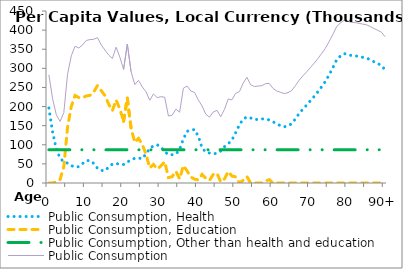
| Category | Public Consumption, Health | Public Consumption, Education | Public Consumption, Other than health and education | Public Consumption |
|---|---|---|---|---|
| 0 | 196111.92 | 0 | 86906.527 | 283018.44 |
|  | 133436.5 | 0 | 86906.527 | 220343.03 |
| 2 | 88632.806 | 2749.898 | 86906.527 | 178289.23 |
| 3 | 64920.223 | 9234.237 | 86906.527 | 161060.99 |
| 4 | 55181.159 | 42082.676 | 86906.527 | 184170.36 |
| 5 | 52090.713 | 145579.95 | 86906.527 | 284577.19 |
| 6 | 45502.735 | 200275.88 | 86906.527 | 332685.14 |
| 7 | 41794.125 | 229000.18 | 86906.527 | 357700.83 |
| 8 | 42657.942 | 223714.41 | 86906.527 | 353278.88 |
| 9 | 50692.114 | 223401.37 | 86906.527 | 361000.01 |
| 10 | 58287.313 | 227707.2 | 86906.527 | 372901.04 |
| 11 | 59000.461 | 229280.22 | 86906.527 | 375187.21 |
| 12 | 51262.619 | 237731.64 | 86906.527 | 375900.78 |
| 13 | 38568.938 | 254785.27 | 86906.527 | 380260.73 |
| 14 | 32911.893 | 241824.55 | 86906.527 | 361642.97 |
| 15 | 32064.109 | 228889.46 | 86906.527 | 347860.09 |
| 16 | 41484.848 | 206529.03 | 86906.527 | 334920.41 |
| 17 | 49717.776 | 189167.73 | 86906.527 | 325792.03 |
| 18 | 51174.337 | 217219.57 | 86906.527 | 355300.43 |
| 19 | 48600.894 | 193762.46 | 86906.527 | 329269.88 |
| 20 | 48534.251 | 161704.42 | 86906.527 | 297145.19 |
| 21 | 54552.955 | 222156.35 | 86906.527 | 363615.83 |
| 22 | 60771.749 | 143551.48 | 86906.527 | 291229.75 |
| 23 | 64640.351 | 106068.21 | 86906.527 | 257615.09 |
| 24 | 65148.004 | 116537.11 | 86906.527 | 268591.64 |
| 25 | 63654.351 | 100989.48 | 86906.527 | 251550.36 |
| 26 | 76349.219 | 75200.063 | 86906.527 | 238455.81 |
| 27 | 90255.966 | 39352.997 | 86906.527 | 216515.49 |
| 28 | 97536.758 | 48595.657 | 86906.527 | 233038.94 |
| 29 | 99927.92 | 36520.805 | 86906.527 | 223355.25 |
| 30 | 94199.243 | 44706.37 | 86906.527 | 225812.14 |
| 31 | 81958.356 | 55668.064 | 86906.527 | 224532.95 |
| 32 | 74126.43 | 14228.037 | 86906.527 | 175260.99 |
| 33 | 74006.099 | 16535.215 | 86906.527 | 177447.84 |
| 34 | 75603.174 | 30758.735 | 86906.527 | 193268.44 |
| 35 | 87825.678 | 10639.618 | 86906.527 | 185371.82 |
| 36 | 115337.87 | 45677.919 | 86906.527 | 247922.31 |
| 37 | 135203.75 | 31522.209 | 86906.527 | 253632.49 |
| 38 | 138272.71 | 15474.179 | 86906.527 | 240653.41 |
| 39 | 139975.02 | 10169.761 | 86906.527 | 237051.31 |
| 40 | 122041.09 | 8097.68 | 86906.527 | 217045.29 |
| 41 | 92184.525 | 22437.142 | 86906.527 | 201528.19 |
| 42 | 80824.629 | 12375.153 | 86906.527 | 180106.31 |
| 43 | 78460.151 | 6962.885 | 86906.527 | 172329.56 |
| 44 | 76481.557 | 22392.899 | 86906.527 | 185780.98 |
| 45 | 77513.979 | 25551.145 | 86906.527 | 189971.65 |
| 46 | 83794.306 | 2777.432 | 86906.527 | 173478.27 |
| 47 | 94955.27 | 10778.687 | 86906.527 | 192640.48 |
| 48 | 102668.95 | 30088.741 | 86906.527 | 219664.22 |
| 49 | 112713.08 | 18141.171 | 86906.527 | 217760.77 |
| 50 | 131754.64 | 16182.113 | 86906.527 | 234843.28 |
| 51 | 152124.29 | 0 | 86906.527 | 239030.82 |
| 52 | 166955.4 | 7059.687 | 86906.527 | 260921.61 |
| 53 | 172923.77 | 16862.903 | 86906.527 | 276693.2 |
| 54 | 170165.72 | 0 | 86906.527 | 257072.25 |
| 55 | 165512.96 | 0 | 86906.527 | 252419.49 |
| 56 | 166740 | 0 | 86906.527 | 253646.53 |
| 57 | 167770.3 | 0 | 86906.527 | 254676.83 |
| 58 | 167578.15 | 5450.643 | 86906.527 | 259935.32 |
| 59 | 164910.7 | 8681.062 | 86906.527 | 260498.29 |
| 60 | 160478.57 | 0 | 86906.527 | 247385.09 |
| 61 | 153673.26 | 0 | 86906.527 | 240579.79 |
| 62 | 150367.63 | 0 | 86906.527 | 237274.16 |
| 63 | 147040.69 | 0 | 86906.527 | 233947.21 |
| 64 | 149456.07 | 0 | 86906.527 | 236362.6 |
| 65 | 155007.84 | 0 | 86906.527 | 241914.37 |
| 66 | 167907.78 | 0 | 86906.527 | 254814.31 |
| 67 | 182239.88 | 0 | 86906.527 | 269146.4 |
| 68 | 193434.12 | 0 | 86906.527 | 280340.65 |
| 69 | 203943.82 | 0 | 86906.527 | 290850.34 |
| 70 | 215342.29 | 0 | 86906.527 | 302248.82 |
| 71 | 226455.29 | 0 | 86906.527 | 313361.82 |
| 72 | 238722.33 | 0 | 86906.527 | 325628.86 |
| 73 | 251824.56 | 0 | 86906.527 | 338731.09 |
| 74 | 265451.3 | 0 | 86906.527 | 352357.83 |
| 75 | 282736.43 | 0 | 86906.527 | 369642.96 |
| 76 | 301546.71 | 0 | 86906.527 | 388453.23 |
| 77 | 321882.04 | 0 | 86906.527 | 408788.56 |
| 78 | 331897.28 | 0 | 86906.527 | 418803.81 |
| 79 | 338551.05 | 0 | 86906.527 | 425457.57 |
| 80 | 336492.86 | 0 | 86906.527 | 423399.38 |
| 81 | 333234.66 | 0 | 86906.527 | 420141.18 |
| 82 | 332729.15 | 0 | 86906.527 | 419635.68 |
| 83 | 330940.97 | 0 | 86906.527 | 417847.5 |
| 84 | 328789.16 | 0 | 86906.527 | 415695.69 |
| 85 | 327028.05 | 0 | 86906.527 | 413934.58 |
| 86 | 322566.79 | 0 | 86906.527 | 409473.32 |
| 87 | 317209.81 | 0 | 86906.527 | 404116.34 |
| 88 | 312823.35 | 0 | 86906.527 | 399729.88 |
| 89 | 307702.77 | 0 | 86906.527 | 394609.29 |
| 90+ | 295629.9 | 0 | 86906.527 | 382536.42 |